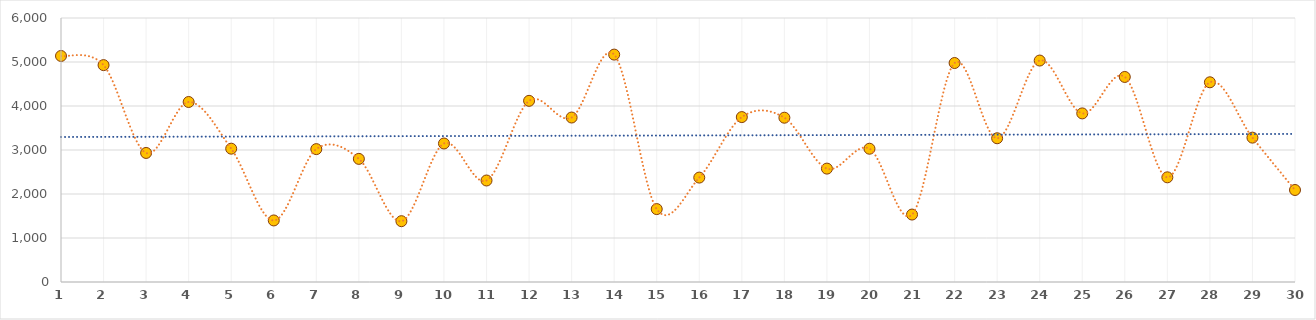
| Category | Series 0 |
|---|---|
| 1.0 | 5137 |
| 2.0 | 4929 |
| 3.0 | 2933 |
| 4.0 | 4091 |
| 5.0 | 3030 |
| 6.0 | 1399 |
| 7.0 | 3020 |
| 8.0 | 2798 |
| 9.0 | 1382 |
| 10.0 | 3148 |
| 11.0 | 2307 |
| 12.0 | 4117 |
| 13.0 | 3738 |
| 14.0 | 5168 |
| 15.0 | 1657 |
| 16.0 | 2373 |
| 17.0 | 3748 |
| 18.0 | 3734 |
| 19.0 | 2577 |
| 20.0 | 3029 |
| 21.0 | 1533 |
| 22.0 | 4977 |
| 23.0 | 3267 |
| 24.0 | 5033 |
| 25.0 | 3832 |
| 26.0 | 4660 |
| 27.0 | 2379 |
| 28.0 | 4539 |
| 29.0 | 3281 |
| 30.0 | 2091 |